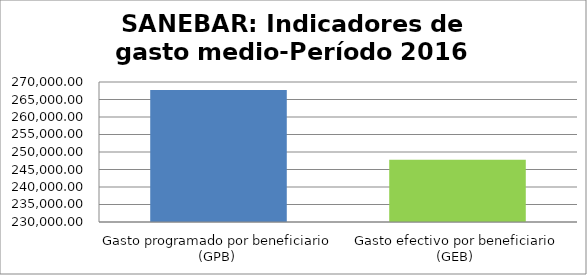
| Category | Series 0 |
|---|---|
| Gasto programado por beneficiario (GPB)  | 267750 |
| Gasto efectivo por beneficiario (GEB)  | 247790.53 |